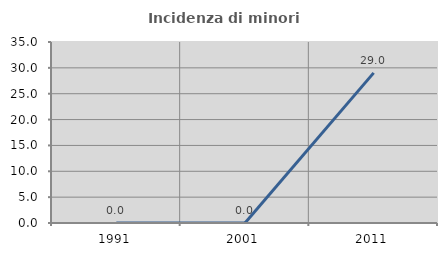
| Category | Incidenza di minori stranieri |
|---|---|
| 1991.0 | 0 |
| 2001.0 | 0 |
| 2011.0 | 29.032 |